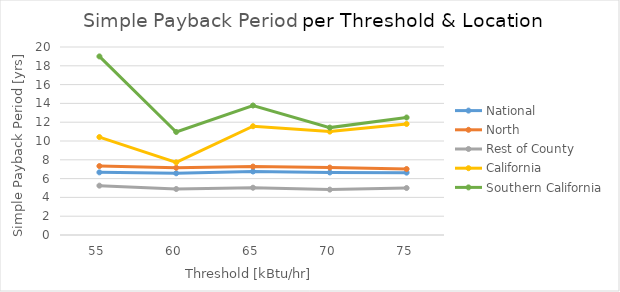
| Category | National | North | Rest of County | California | Southern California |
|---|---|---|---|---|---|
| 55.0 | 6.664 | 7.335 | 5.25 | 10.42 | 18.998 |
| 60.0 | 6.567 | 7.158 | 4.893 | 7.729 | 10.963 |
| 65.0 | 6.758 | 7.28 | 5.03 | 11.571 | 13.775 |
| 70.0 | 6.652 | 7.176 | 4.829 | 10.999 | 11.425 |
| 75.0 | 6.633 | 7.021 | 4.999 | 11.812 | 12.5 |